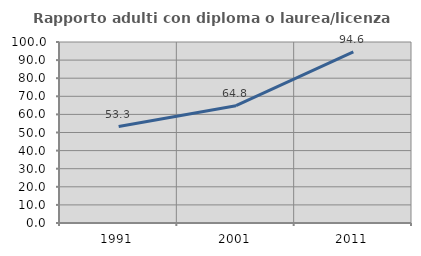
| Category | Rapporto adulti con diploma o laurea/licenza media  |
|---|---|
| 1991.0 | 53.264 |
| 2001.0 | 64.793 |
| 2011.0 | 94.588 |